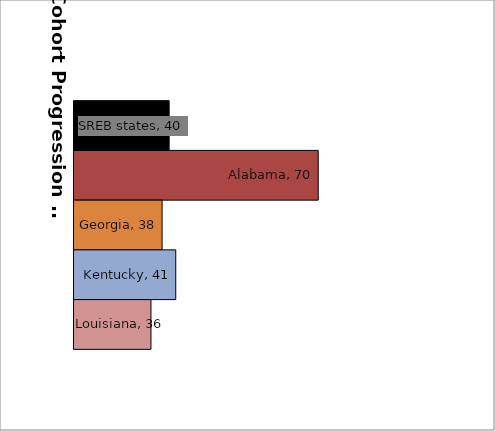
| Category | SREB states | Alabama | Georgia | Kentucky | Louisiana |
|---|---|---|---|---|---|
| 0 | 39.669 | 70.486 | 38.212 | 41.037 | 35.911 |